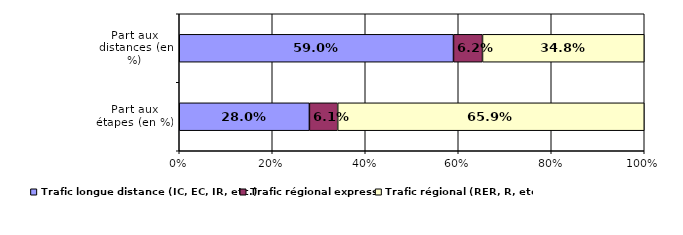
| Category | Trafic longue distance (IC, EC, IR, etc.) | Trafic régional express  | Trafic régional (RER, R, etc.) |
|---|---|---|---|
| Part aux étapes (en %) | 0.28 | 0.061 | 0.659 |
| Part aux  distances (en %) | 0.59 | 0.062 | 0.348 |